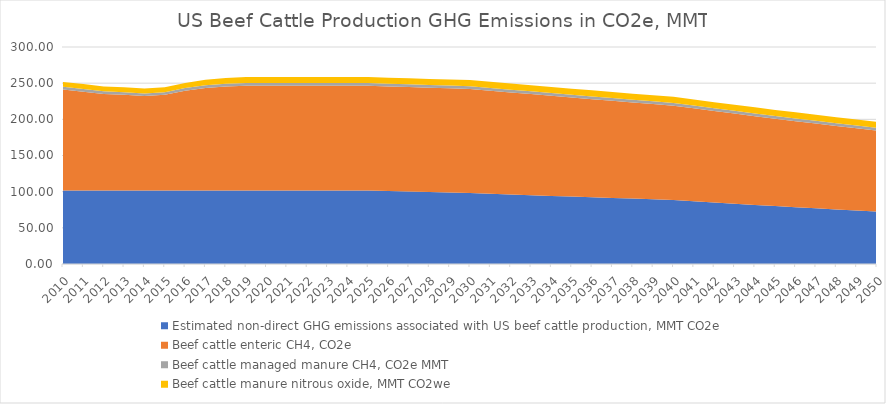
| Category | Estimated non-direct GHG emissions associated with US beef cattle production, MMT CO2e | Beef cattle enteric CH4, CO2e | Beef cattle managed manure CH4, CO2e MMT | Beef cattle manure nitrous oxide, MMT CO2we |
|---|---|---|---|---|
| 2010.0 | 101.745 | 139.552 | 3.696 | 6.704 |
| 2011.0 | 101.745 | 136.444 | 3.668 | 6.864 |
| 2012.0 | 101.745 | 133.364 | 3.584 | 6.837 |
| 2013.0 | 101.745 | 132.216 | 3.416 | 6.89 |
| 2014.0 | 101.745 | 130.48 | 3.36 | 6.89 |
| 2015.0 | 101.745 | 132.216 | 3.528 | 6.837 |
| 2016.0 | 101.745 | 137.732 | 3.696 | 7.208 |
| 2017.0 | 101.745 | 141.456 | 3.808 | 7.606 |
| 2018.0 | 101.745 | 143.5 | 3.78 | 8.215 |
| 2019.0 | 101.745 | 144.536 | 3.808 | 8.348 |
| 2020.0 | 101.745 | 144.564 | 3.78 | 8.348 |
| 2021.0 | 101.745 | 144.564 | 3.78 | 8.348 |
| 2022.0 | 101.745 | 144.564 | 3.78 | 8.348 |
| 2023.0 | 101.745 | 144.564 | 3.78 | 8.348 |
| 2024.0 | 101.745 | 144.564 | 3.78 | 8.348 |
| 2025.0 | 101.745 | 144.564 | 3.78 | 8.348 |
| 2026.0 | 100.982 | 144.469 | 3.78 | 8.348 |
| 2027.0 | 100.224 | 144.375 | 3.78 | 8.348 |
| 2028.0 | 99.472 | 144.281 | 3.78 | 8.348 |
| 2029.0 | 98.726 | 144.187 | 3.78 | 8.348 |
| 2030.0 | 97.986 | 144.094 | 3.78 | 8.348 |
| 2031.0 | 97.006 | 142.653 | 3.78 | 8.348 |
| 2032.0 | 96.036 | 141.227 | 3.78 | 8.348 |
| 2033.0 | 95.076 | 139.814 | 3.78 | 8.348 |
| 2034.0 | 94.125 | 138.416 | 3.78 | 8.348 |
| 2035.0 | 93.184 | 137.032 | 3.78 | 8.348 |
| 2036.0 | 92.252 | 135.662 | 3.78 | 8.348 |
| 2037.0 | 91.329 | 134.305 | 3.78 | 8.348 |
| 2038.0 | 90.416 | 132.962 | 3.78 | 8.348 |
| 2039.0 | 89.512 | 131.632 | 3.78 | 8.348 |
| 2040.0 | 88.617 | 130.316 | 3.78 | 8.348 |
| 2041.0 | 86.844 | 128.361 | 3.78 | 8.348 |
| 2042.0 | 85.108 | 126.436 | 3.78 | 8.348 |
| 2043.0 | 83.405 | 124.539 | 3.78 | 8.348 |
| 2044.0 | 81.737 | 122.671 | 3.78 | 8.348 |
| 2045.0 | 80.103 | 120.831 | 3.78 | 8.348 |
| 2046.0 | 78.5 | 119.019 | 3.78 | 8.348 |
| 2047.0 | 76.93 | 117.234 | 3.78 | 8.348 |
| 2048.0 | 75.392 | 115.475 | 3.78 | 8.348 |
| 2049.0 | 73.884 | 113.743 | 3.78 | 8.348 |
| 2050.0 | 72.406 | 112.037 | 3.78 | 8.348 |